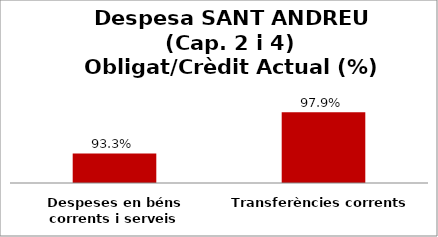
| Category | Series 0 |
|---|---|
| Despeses en béns corrents i serveis | 0.933 |
| Transferències corrents | 0.979 |